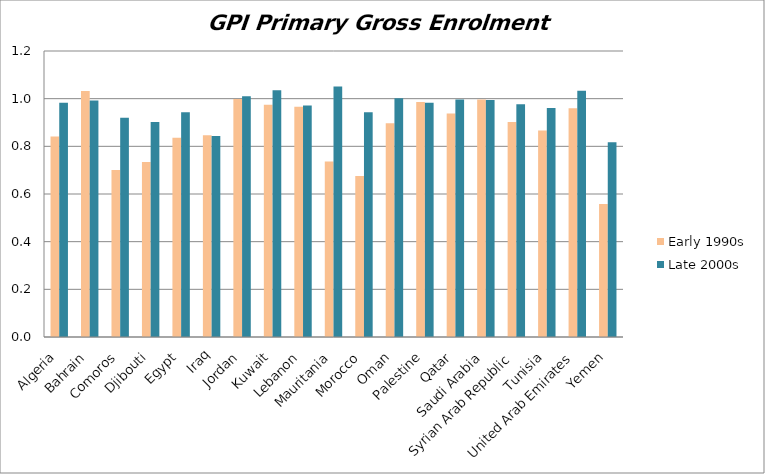
| Category | Early 1990s | Late 2000s |
|---|---|---|
| Algeria | 0.841 | 0.983 |
| Bahrain | 1.033 | 0.992 |
| Comoros | 0.701 | 0.92 |
| Djibouti | 0.734 | 0.902 |
| Egypt | 0.836 | 0.943 |
| Iraq | 0.847 | 0.843 |
| Jordan | 0.999 | 1.01 |
| Kuwait | 0.974 | 1.035 |
| Lebanon | 0.966 | 0.971 |
| Mauritania | 0.736 | 1.051 |
| Morocco | 0.676 | 0.943 |
| Oman | 0.897 | 1.002 |
| Palestine | 0.986 | 0.982 |
| Qatar | 0.937 | 0.996 |
| Saudi Arabia | 0.996 | 0.995 |
| Syrian Arab Republic | 0.902 | 0.977 |
| Tunisia | 0.866 | 0.961 |
| United Arab Emirates | 0.96 | 1.033 |
| Yemen | 0.558 | 0.817 |